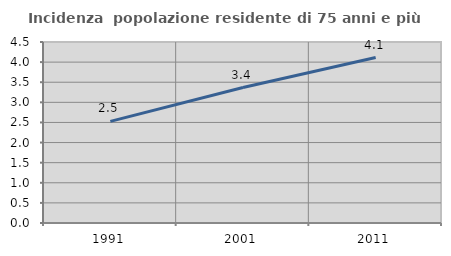
| Category | Incidenza  popolazione residente di 75 anni e più |
|---|---|
| 1991.0 | 2.527 |
| 2001.0 | 3.368 |
| 2011.0 | 4.114 |